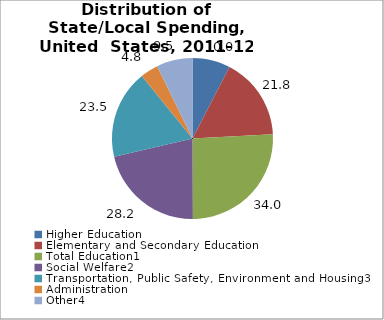
| Category | Series 0 |
|---|---|
| Higher Education | 10.023 |
| Elementary and Secondary Education | 21.818 |
| Total Education1 | 33.982 |
| Social Welfare2 | 28.235 |
| Transportation, Public Safety, Environment and Housing3 | 23.475 |
| Administration | 4.782 |
| Other4 | 9.526 |